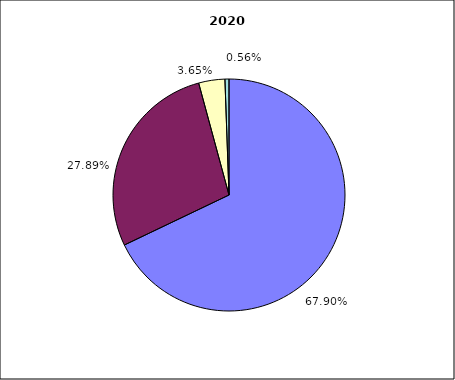
| Category | 2020 |
|---|---|
| Salarissen | 8718668 |
| Werking | 3580591.435 |
| Investeringen | 468994 |
| Andere | 72003 |